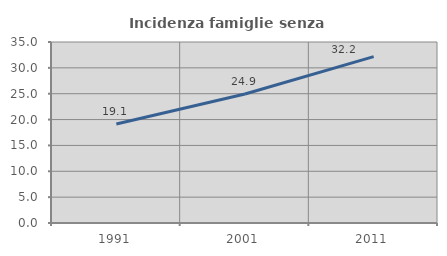
| Category | Incidenza famiglie senza nuclei |
|---|---|
| 1991.0 | 19.127 |
| 2001.0 | 24.938 |
| 2011.0 | 32.182 |